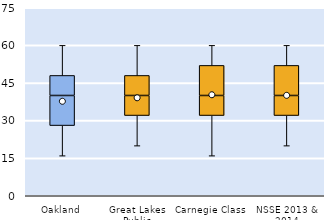
| Category | 25th | 50th | 75th |
|---|---|---|---|
| Oakland | 28 | 12 | 8 |
| Great Lakes Public | 32 | 8 | 8 |
| Carnegie Class | 32 | 8 | 12 |
| NSSE 2013 & 2014 | 32 | 8 | 12 |